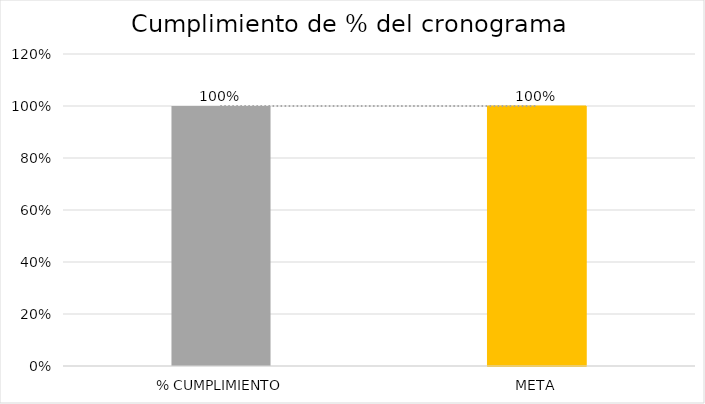
| Category | Series 2 |
|---|---|
| % CUMPLIMIENTO | 1 |
| META | 1 |